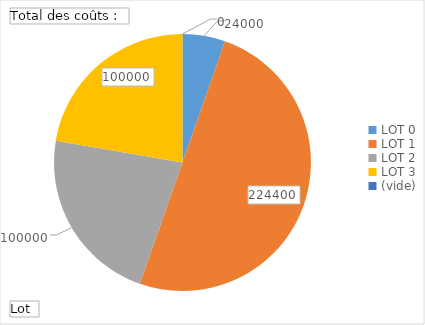
| Category | Total |
|---|---|
| LOT 0 | 24000 |
| LOT 1 | 224400 |
| LOT 2 | 100000 |
| LOT 3 | 100000 |
| (vide) | 0 |